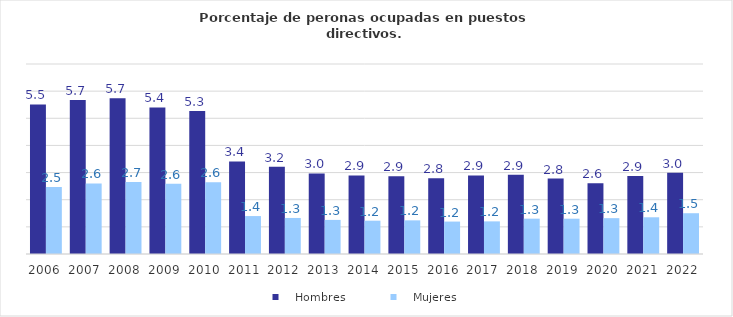
| Category |    Hombres |    Mujeres |
|---|---|---|
| 2006.0 | 5.51 | 2.471 |
| 2007.0 | 5.674 | 2.598 |
| 2008.0 | 5.734 | 2.653 |
| 2009.0 | 5.401 | 2.588 |
| 2010.0 | 5.264 | 2.644 |
| 2011.0 | 3.412 | 1.398 |
| 2012.0 | 3.21 | 1.328 |
| 2013.0 | 2.97 | 1.256 |
| 2014.0 | 2.895 | 1.227 |
| 2015.0 | 2.865 | 1.239 |
| 2016.0 | 2.789 | 1.195 |
| 2017.0 | 2.892 | 1.202 |
| 2018.0 | 2.921 | 1.302 |
| 2019.0 | 2.777 | 1.301 |
| 2020.0 | 2.607 | 1.321 |
| 2021.0 | 2.874 | 1.353 |
| 2022.0 | 2.994 | 1.503 |